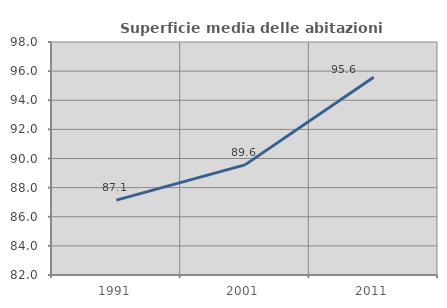
| Category | Superficie media delle abitazioni occupate |
|---|---|
| 1991.0 | 87.141 |
| 2001.0 | 89.562 |
| 2011.0 | 95.583 |